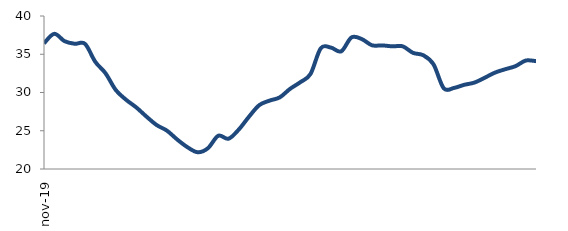
| Category | Series 0 |
|---|---|
| 2019-11-01 | 36.425 |
| 2019-12-01 | 37.671 |
| 2020-01-01 | 36.714 |
| 2020-02-01 | 36.369 |
| 2020-03-01 | 36.361 |
| 2020-04-01 | 34.017 |
| 2020-05-01 | 32.52 |
| 2020-06-01 | 30.328 |
| 2020-07-01 | 29.058 |
| 2020-08-01 | 28.052 |
| 2020-09-01 | 26.848 |
| 2020-10-01 | 25.737 |
| 2020-11-01 | 25.008 |
| 2020-12-01 | 23.848 |
| 2021-01-01 | 22.846 |
| 2021-02-01 | 22.188 |
| 2021-03-01 | 22.726 |
| 2021-04-01 | 24.345 |
| 2021-05-01 | 23.958 |
| 2021-06-01 | 25.156 |
| 2021-07-01 | 26.838 |
| 2021-08-01 | 28.346 |
| 2021-09-01 | 28.934 |
| 2021-10-01 | 29.363 |
| 2021-11-01 | 30.47 |
| 2021-12-01 | 31.341 |
| 2022-01-01 | 32.424 |
| 2022-02-01 | 35.771 |
| 2022-03-01 | 35.868 |
| 2022-04-01 | 35.381 |
| 2022-05-01 | 37.2 |
| 2022-06-01 | 36.986 |
| 2022-07-01 | 36.172 |
| 2022-08-01 | 36.157 |
| 2022-09-01 | 36.033 |
| 2022-10-01 | 36.034 |
| 2022-11-01 | 35.183 |
| 2022-12-01 | 34.87 |
| 2023-01-01 | 33.684 |
| 2023-02-01 | 30.55 |
| 2023-03-01 | 30.596 |
| 2023-04-01 | 31.004 |
| 2023-05-01 | 31.3 |
| 2023-06-01 | 31.93 |
| 2023-07-01 | 32.601 |
| 2023-08-01 | 33.043 |
| 2023-09-01 | 33.443 |
| 2023-10-01 | 34.176 |
| 2023-11-01 | 34.098 |